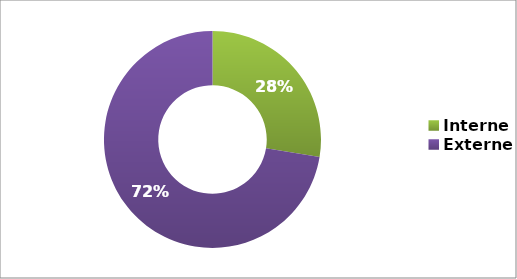
| Category | Series 0 |
|---|---|
| Interne | 0.276 |
| Externe | 0.724 |